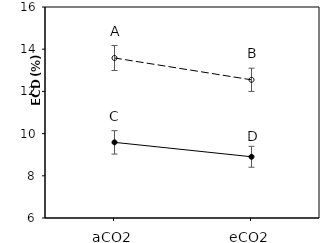
| Category | Bt | Xy |
|---|---|---|
| aCO2 | 9.585 | 13.584 |
| eCO2 | 8.902 | 12.549 |